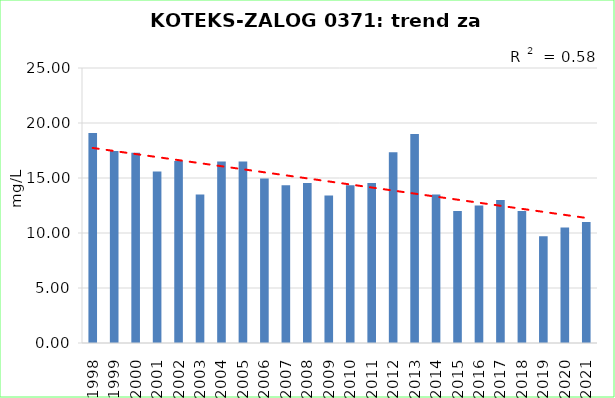
| Category | Vsota |
|---|---|
| 1998 | 19.1 |
| 1999 | 17.45 |
| 2000 | 17.3 |
| 2001 | 15.6 |
| 2002 | 16.55 |
| 2003 | 13.5 |
| 2004 | 16.5 |
| 2005 | 16.5 |
| 2006 | 14.95 |
| 2007 | 14.35 |
| 2008 | 14.55 |
| 2009 | 13.4 |
| 2010 | 14.35 |
| 2011 | 14.55 |
| 2012 | 17.35 |
| 2013 | 19 |
| 2014 | 13.5 |
| 2015 | 12 |
| 2016 | 12.5 |
| 2017 | 13 |
| 2018 | 12 |
| 2019 | 9.7 |
| 2020 | 10.5 |
| 2021 | 11 |